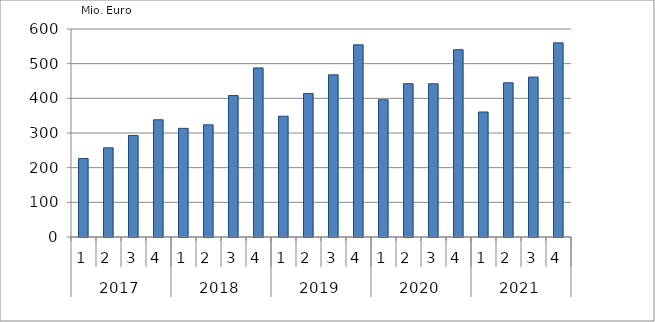
| Category | Ausbaugewerblicher Umsatz3 |
|---|---|
| 0 | 226552.317 |
| 1 | 257191.13 |
| 2 | 292853.372 |
| 3 | 338154.691 |
| 4 | 313433.569 |
| 5 | 323547.694 |
| 6 | 408057.42 |
| 7 | 487843.765 |
| 8 | 348466.115 |
| 9 | 414145.554 |
| 10 | 467849.207 |
| 11 | 554369.34 |
| 12 | 395996.128 |
| 13 | 442270.528 |
| 14 | 441987.109 |
| 15 | 540250.513 |
| 16 | 360578.959 |
| 17 | 444796.964 |
| 18 | 461290.095 |
| 19 | 559989.337 |